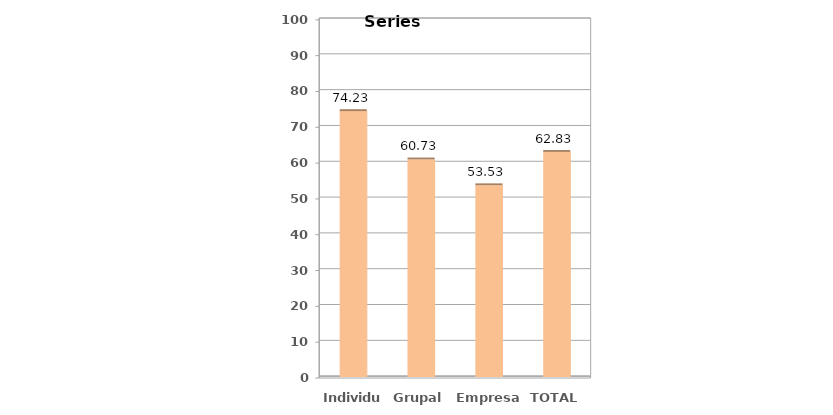
| Category | Series1 |
|---|---|
| Individual | 74.228 |
| Grupal | 60.735 |
| Empresa | 53.526 |
| TOTAL | 62.83 |